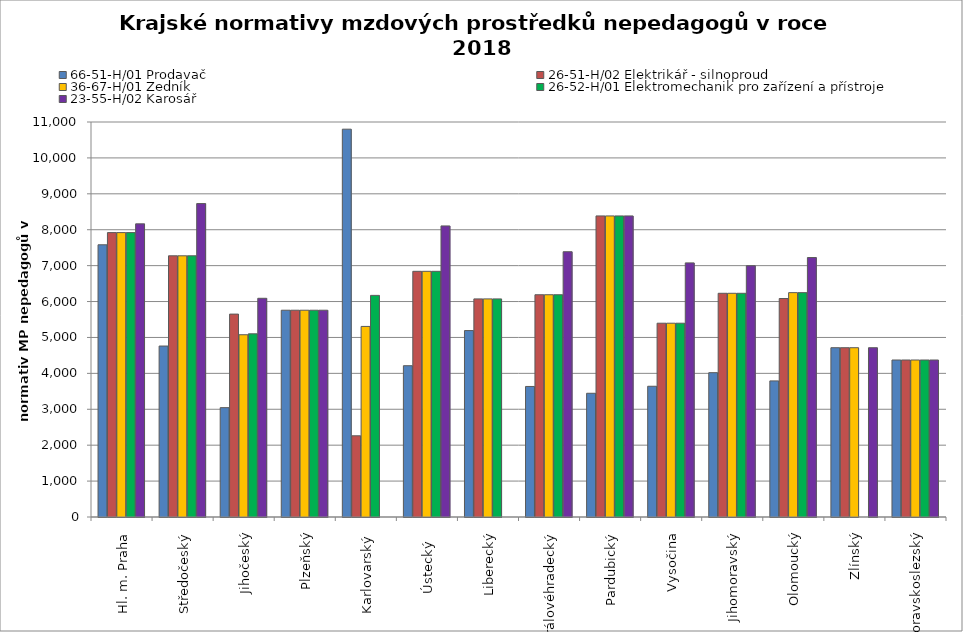
| Category | 66-51-H/01 Prodavač | 26-51-H/02 Elektrikář - silnoproud | 36-67-H/01 Zedník | 26-52-H/01 Elektromechanik pro zařízení a přístroje | 23-55-H/02 Karosář |
|---|---|---|---|---|---|
| Hl. m. Praha | 7580.571 | 7920 | 7920 | 7920 | 8163.692 |
| Středočeský | 4760.945 | 7273.667 | 7273.667 | 7273.667 | 8728.4 |
| Jihočeský | 3045.437 | 5650.375 | 5075.486 | 5101.07 | 6090.874 |
| Plzeňský | 5758.269 | 5758.269 | 5758.269 | 5758.269 | 5758.269 |
| Karlovarský  | 10800 | 2261.78 | 5307.125 | 6171.429 | 0 |
| Ústecký   | 4213.307 | 6841.543 | 6841.543 | 6841.543 | 8105.6 |
| Liberecký | 5191.705 | 6073.902 | 6073.902 | 6073.902 | 0 |
| Královéhradecký | 3635.25 | 6189.406 | 6189.406 | 6189.406 | 7387.163 |
| Pardubický | 3445.644 | 8384.4 | 8384.4 | 8384.4 | 8384.4 |
| Vysočina | 3641.109 | 5396.518 | 5396.518 | 5396.518 | 7076.728 |
| Jihomoravský | 4018.845 | 6230.052 | 6230.052 | 6230.052 | 6996.509 |
| Olomoucký | 3790.051 | 6084.525 | 6248.131 | 6248.131 | 7225.373 |
| Zlínský | 4714.286 | 4714.286 | 4714.286 | 0 | 4714.286 |
| Moravskoslezský | 4371.904 | 4371.904 | 4371.904 | 4371.904 | 4371.904 |